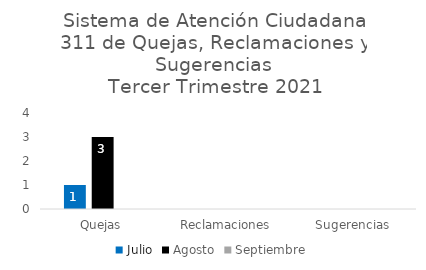
| Category | Julio | Agosto | Septiembre |
|---|---|---|---|
| Quejas | 1 | 3 | 0 |
| Reclamaciones | 0 | 0 | 0 |
| Sugerencias | 0 | 0 | 0 |